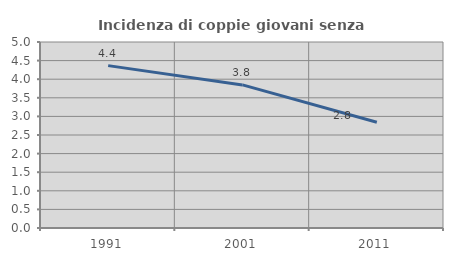
| Category | Incidenza di coppie giovani senza figli |
|---|---|
| 1991.0 | 4.365 |
| 2001.0 | 3.846 |
| 2011.0 | 2.843 |